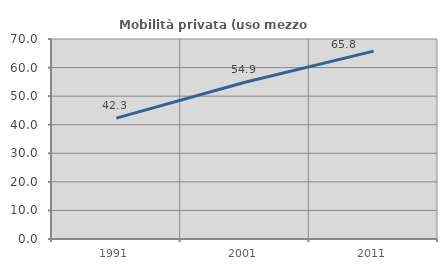
| Category | Mobilità privata (uso mezzo privato) |
|---|---|
| 1991.0 | 42.318 |
| 2001.0 | 54.867 |
| 2011.0 | 65.75 |